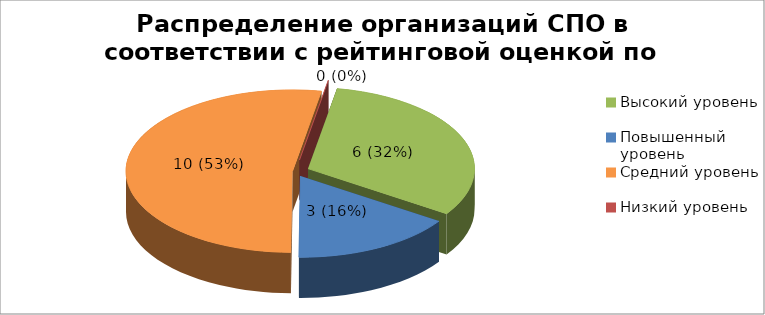
| Category | Series 8 | Series 9 |
|---|---|---|
| Высокий уровень | 0.316 |  |
| Повышенный уровень | 0.158 |  |
| Средний уровень | 0.526 |  |
| Низкий уровень | 0 |  |